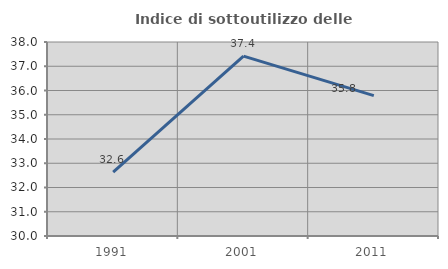
| Category | Indice di sottoutilizzo delle abitazioni  |
|---|---|
| 1991.0 | 32.632 |
| 2001.0 | 37.415 |
| 2011.0 | 35.788 |